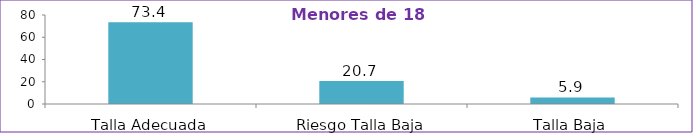
| Category | Series 0 |
|---|---|
| Talla Adecuada | 73.4 |
| Riesgo Talla Baja | 20.7 |
| Talla Baja | 5.9 |